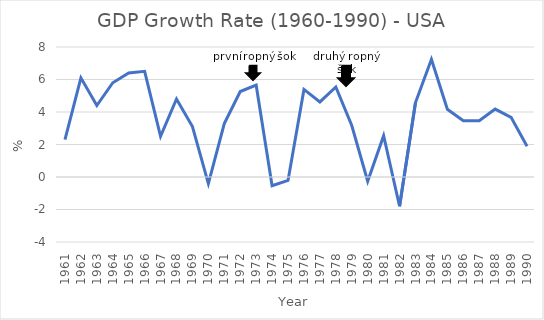
| Category | USA |
|---|---|
| 1961.0 | 2.3 |
| 1962.0 | 6.1 |
| 1963.0 | 4.4 |
| 1964.0 | 5.8 |
| 1965.0 | 6.4 |
| 1966.0 | 6.5 |
| 1967.0 | 2.5 |
| 1968.0 | 4.8 |
| 1969.0 | 3.1 |
| 1970.0 | -0.41 |
| 1971.0 | 3.29 |
| 1972.0 | 5.26 |
| 1973.0 | 5.65 |
| 1974.0 | -0.54 |
| 1975.0 | -0.21 |
| 1976.0 | 5.39 |
| 1977.0 | 4.62 |
| 1978.0 | 5.54 |
| 1979.0 | 3.17 |
| 1980.0 | -0.26 |
| 1981.0 | 2.54 |
| 1982.0 | -1.8 |
| 1983.0 | 4.58 |
| 1984.0 | 7.24 |
| 1985.0 | 4.17 |
| 1986.0 | 3.46 |
| 1987.0 | 3.46 |
| 1988.0 | 4.18 |
| 1989.0 | 3.67 |
| 1990.0 | 1.89 |